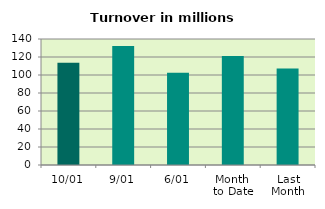
| Category | Series 0 |
|---|---|
| 10/01 | 113.662 |
| 9/01 | 132.188 |
| 6/01 | 102.495 |
| Month 
to Date | 121.135 |
| Last
Month | 107.094 |